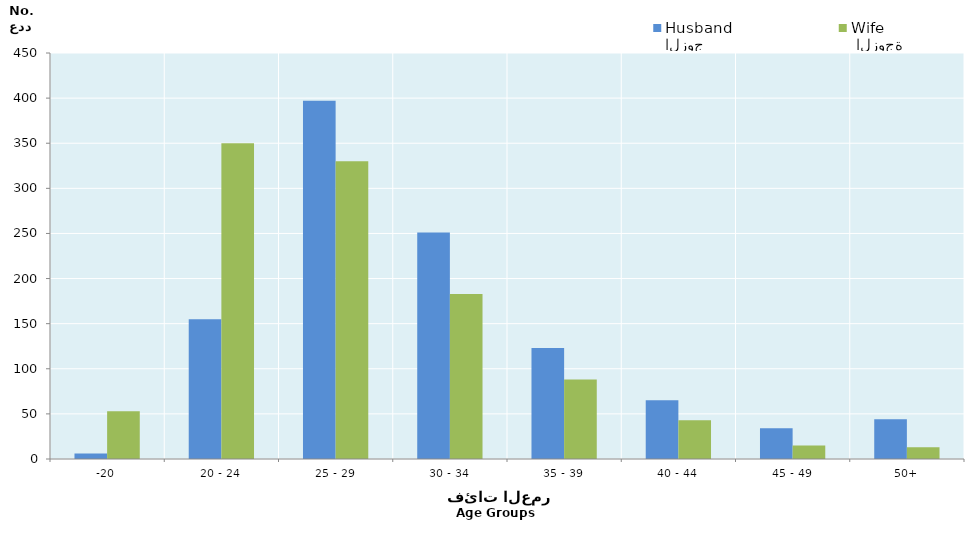
| Category | الزوج
Husband |  الزوجة
Wife |
|---|---|---|
| -20 | 6 | 53 |
| 20 - 24 | 155 | 350 |
| 25 - 29 | 397 | 330 |
| 30 - 34 | 251 | 183 |
| 35 - 39 | 123 | 88 |
| 40 - 44 | 65 | 43 |
| 45 - 49 | 34 | 15 |
| 50+ | 44 | 13 |